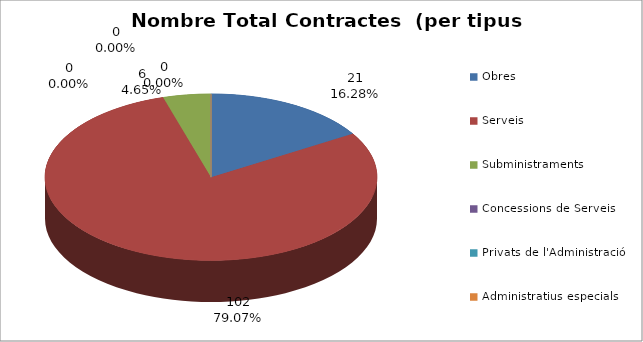
| Category | Nombre Total Contractes |
|---|---|
| Obres | 21 |
| Serveis | 102 |
| Subministraments | 6 |
| Concessions de Serveis | 0 |
| Privats de l'Administració | 0 |
| Administratius especials | 0 |